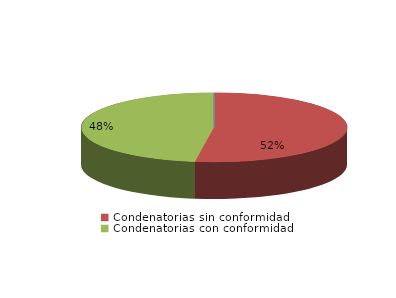
| Category | Series 0 |
|---|---|
| Absolutorias | 0 |
| Condenatorias sin conformidad | 23 |
| Condenatorias con conformidad | 21 |